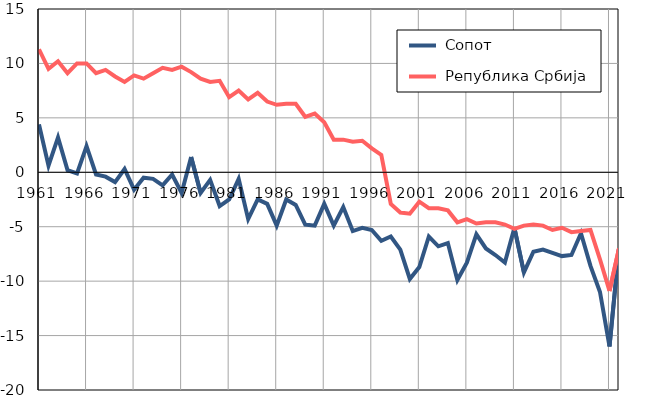
| Category |  Сопот |  Република Србија |
|---|---|---|
| 1961.0 | 4.4 | 11.3 |
| 1962.0 | 0.6 | 9.5 |
| 1963.0 | 3.2 | 10.2 |
| 1964.0 | 0.2 | 9.1 |
| 1965.0 | -0.1 | 10 |
| 1966.0 | 2.4 | 10 |
| 1967.0 | -0.2 | 9.1 |
| 1968.0 | -0.4 | 9.4 |
| 1969.0 | -0.9 | 8.8 |
| 1970.0 | 0.3 | 8.3 |
| 1971.0 | -1.6 | 8.9 |
| 1972.0 | -0.5 | 8.6 |
| 1973.0 | -0.6 | 9.1 |
| 1974.0 | -1.2 | 9.6 |
| 1975.0 | -0.2 | 9.4 |
| 1976.0 | -1.9 | 9.7 |
| 1977.0 | 1.4 | 9.2 |
| 1978.0 | -1.9 | 8.6 |
| 1979.0 | -0.7 | 8.3 |
| 1980.0 | -3.1 | 8.4 |
| 1981.0 | -2.5 | 6.9 |
| 1982.0 | -0.6 | 7.5 |
| 1983.0 | -4.3 | 6.7 |
| 1984.0 | -2.5 | 7.3 |
| 1985.0 | -2.9 | 6.5 |
| 1986.0 | -4.9 | 6.2 |
| 1987.0 | -2.5 | 6.3 |
| 1988.0 | -3 | 6.3 |
| 1989.0 | -4.8 | 5.1 |
| 1990.0 | -4.9 | 5.4 |
| 1991.0 | -2.9 | 4.6 |
| 1992.0 | -4.9 | 3 |
| 1993.0 | -3.2 | 3 |
| 1994.0 | -5.4 | 2.8 |
| 1995.0 | -5.1 | 2.9 |
| 1996.0 | -5.3 | 2.2 |
| 1997.0 | -6.3 | 1.6 |
| 1998.0 | -5.9 | -2.9 |
| 1999.0 | -7.1 | -3.7 |
| 2000.0 | -9.8 | -3.8 |
| 2001.0 | -8.7 | -2.7 |
| 2002.0 | -5.9 | -3.3 |
| 2003.0 | -6.8 | -3.3 |
| 2004.0 | -6.5 | -3.5 |
| 2005.0 | -9.9 | -4.6 |
| 2006.0 | -8.3 | -4.3 |
| 2007.0 | -5.7 | -4.7 |
| 2008.0 | -7 | -4.6 |
| 2009.0 | -7.6 | -4.6 |
| 2010.0 | -8.3 | -4.8 |
| 2011.0 | -5.1 | -5.2 |
| 2012.0 | -9.2 | -4.9 |
| 2013.0 | -7.3 | -4.8 |
| 2014.0 | -7.1 | -4.9 |
| 2015.0 | -7.4 | -5.3 |
| 2016.0 | -7.7 | -5.1 |
| 2017.0 | -7.6 | -5.5 |
| 2018.0 | -5.6 | -5.4 |
| 2019.0 | -8.6 | -5.3 |
| 2020.0 | -11 | -8 |
| 2021.0 | -16 | -10.9 |
| 2022.0 | -7 | -7 |